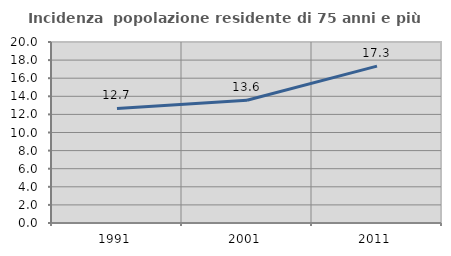
| Category | Incidenza  popolazione residente di 75 anni e più |
|---|---|
| 1991.0 | 12.662 |
| 2001.0 | 13.563 |
| 2011.0 | 17.333 |